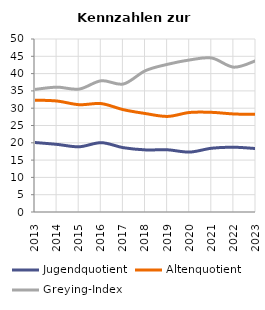
| Category | Jugendquotient | Altenquotient | Greying-Index |
|---|---|---|---|
| 2013.0 | 20.084 | 32.332 | 35.427 |
| 2014.0 | 19.539 | 32.074 | 36.084 |
| 2015.0 | 18.852 | 31.011 | 35.526 |
| 2016.0 | 20.036 | 31.324 | 37.937 |
| 2017.0 | 18.586 | 29.569 | 37 |
| 2018.0 | 17.951 | 28.455 | 40.855 |
| 2019.0 | 17.978 | 27.623 | 42.687 |
| 2020.0 | 17.32 | 28.77 | 43.95 |
| 2021.0 | 18.437 | 28.802 | 44.499 |
| 2022.0 | 18.72 | 28.33 | 41.86 |
| 2023.0 | 18.333 | 28.211 | 43.75 |